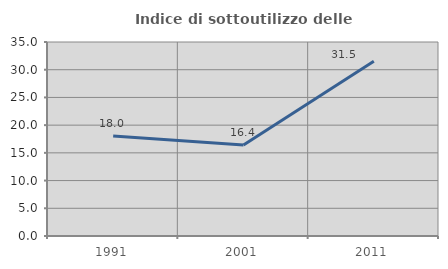
| Category | Indice di sottoutilizzo delle abitazioni  |
|---|---|
| 1991.0 | 18.041 |
| 2001.0 | 16.4 |
| 2011.0 | 31.522 |